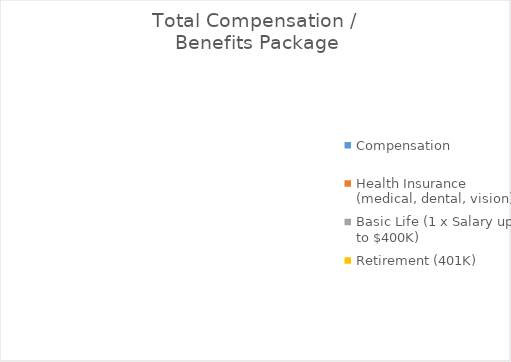
| Category | Series 0 |
|---|---|
| Compensation | 0 |
| Health Insurance (medical, dental, vision) | 0 |
| Basic Life (1 x Salary up to $400K) | 0 |
| Retirement (401K) | 0 |